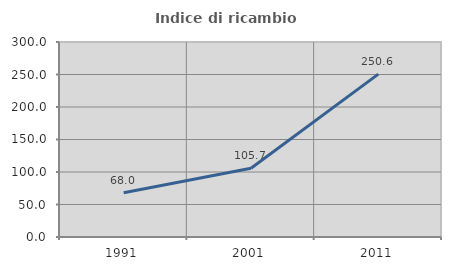
| Category | Indice di ricambio occupazionale  |
|---|---|
| 1991.0 | 68.033 |
| 2001.0 | 105.691 |
| 2011.0 | 250.602 |